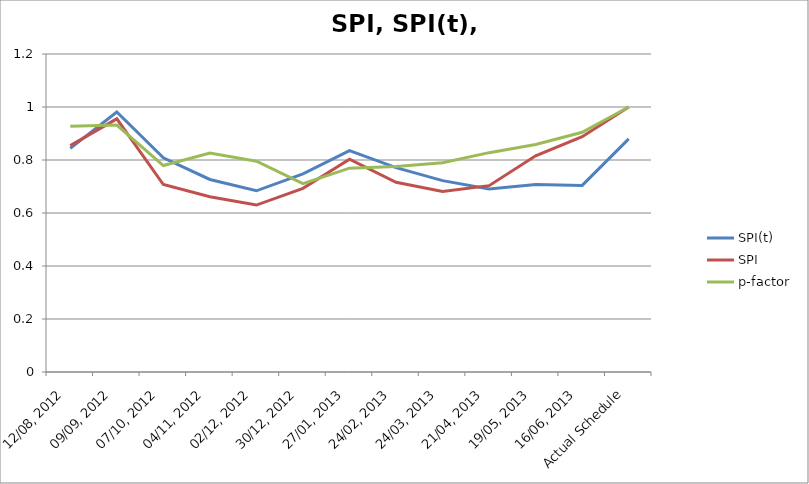
| Category | SPI(t) | SPI | p-factor |
|---|---|---|---|
| 12/08, 2012 | 0.844 | 0.854 | 0.927 |
| 09/09, 2012 | 0.981 | 0.955 | 0.932 |
| 07/10, 2012 | 0.808 | 0.707 | 0.779 |
| 04/11, 2012 | 0.727 | 0.661 | 0.826 |
| 02/12, 2012 | 0.684 | 0.63 | 0.796 |
| 30/12, 2012 | 0.748 | 0.693 | 0.711 |
| 27/01, 2013 | 0.836 | 0.803 | 0.769 |
| 24/02, 2013 | 0.771 | 0.716 | 0.776 |
| 24/03, 2013 | 0.722 | 0.681 | 0.789 |
| 21/04, 2013 | 0.691 | 0.703 | 0.828 |
| 19/05, 2013 | 0.707 | 0.816 | 0.858 |
| 16/06, 2013 | 0.704 | 0.888 | 0.905 |
| Actual Schedule | 0.88 | 1 | 1 |